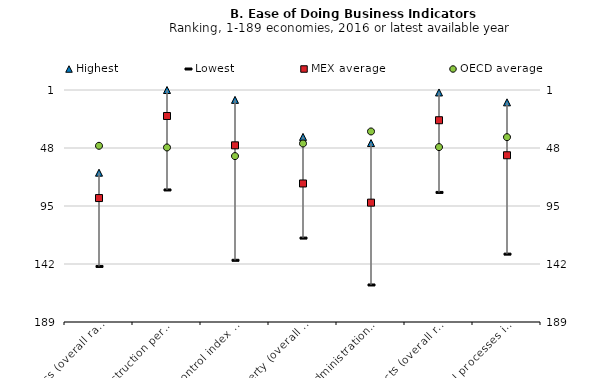
| Category | Highest | Lowest | MEX average |
|---|---|---|---|
| 0 | 68 | 144 | 88.562 |
| 1 | 1 | 82 | 22.062 |
| 2 | 9 | 139 | 45.844 |
| 3 | 39 | 121 | 76.75 |
| 4 | 44 | 159 | 92.281 |
| 5 | 3 | 84 | 25.5 |
| 6 | 11 | 134 | 53.875 |